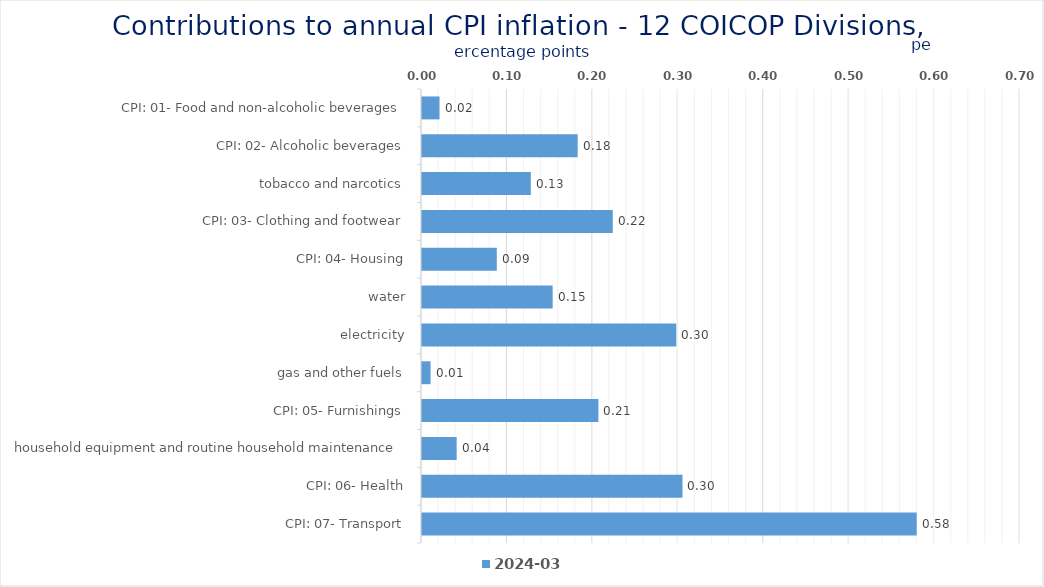
| Category | 2024-03 |
|---|---|
| CPI: 01- Food and non-alcoholic beverages | 0.021 |
| CPI: 02- Alcoholic beverages, tobacco and narcotics | 0.182 |
| CPI: 03- Clothing and footwear | 0.127 |
| CPI: 04- Housing, water, electricity, gas and other fuels | 0.223 |
| CPI: 05- Furnishings, household equipment and routine household maintenance | 0.088 |
| CPI: 06- Health | 0.153 |
| CPI: 07- Transport | 0.298 |
| CPI: 08- Communication | 0.01 |
| CPI: 09- Recreation and culture | 0.206 |
| CPI: 10- Education | 0.041 |
| CPI: 11- Restaurants and hotels | 0.305 |
| CPI: 12- Miscellaneous goods and services | 0.579 |